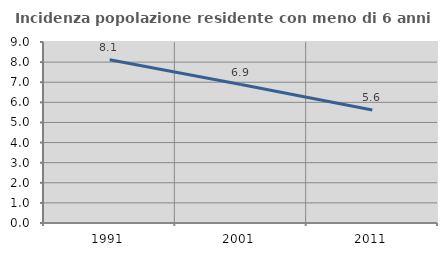
| Category | Incidenza popolazione residente con meno di 6 anni |
|---|---|
| 1991.0 | 8.115 |
| 2001.0 | 6.886 |
| 2011.0 | 5.616 |